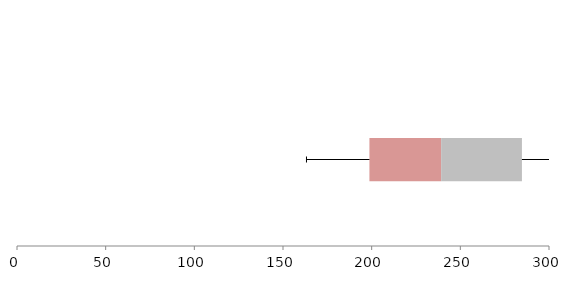
| Category | Series 1 | Series 2 | Series 3 |
|---|---|---|---|
| 0 | 198.736 | 40.447 | 45.555 |